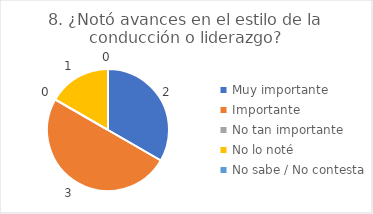
| Category | 8. ¿Notó avances en el estilo de la conducción o liderazgo? |
|---|---|
| Muy importante  | 0.333 |
| Importante  | 0.5 |
| No tan importante  | 0 |
| No lo noté  | 0.167 |
| No sabe / No contesta | 0 |